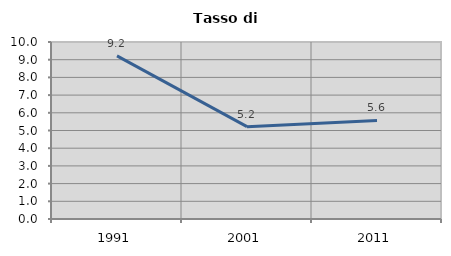
| Category | Tasso di disoccupazione   |
|---|---|
| 1991.0 | 9.213 |
| 2001.0 | 5.217 |
| 2011.0 | 5.571 |